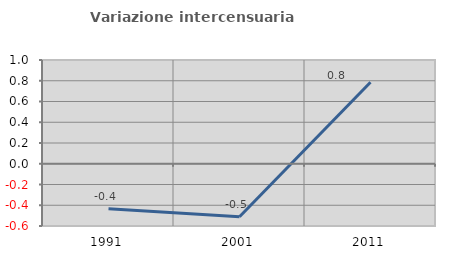
| Category | Variazione intercensuaria annua |
|---|---|
| 1991.0 | -0.433 |
| 2001.0 | -0.51 |
| 2011.0 | 0.786 |